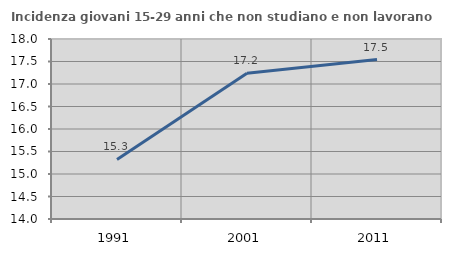
| Category | Incidenza giovani 15-29 anni che non studiano e non lavorano  |
|---|---|
| 1991.0 | 15.323 |
| 2001.0 | 17.241 |
| 2011.0 | 17.544 |